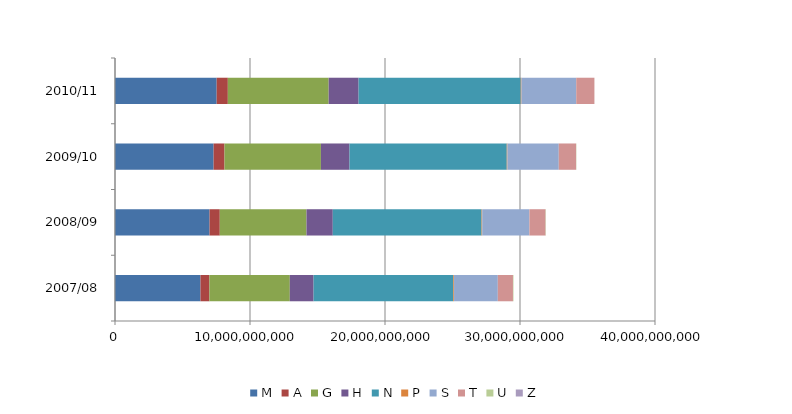
| Category | M | A | G | H | N | P | S | T | U | Z |
|---|---|---|---|---|---|---|---|---|---|---|
| 2007/08 | 6331278809 | 661263250 | 5956031615 | 1761360727 | 10348164238 | 55388343 | 3243362907 | 1121776209 | 35393429 | 0 |
| 2008/09 | 7004251844 | 758105594 | 6421954063 | 1948437219 | 11020440530 | 49969610 | 3495137805 | 1195263582 | 21076125 | 0 |
| 2009/10 | 7303800959 | 807194125 | 7143000250 | 2115180875 | 11650604844 | 50866790 | 3802187699 | 1283066566 | 17228250 | 0 |
| 2010/11 | 7531285686 | 827195906 | 7469296000 | 2216987813 | 12010701373 | 53823700 | 4055609924 | 1346591230 | 2313281 | 0 |